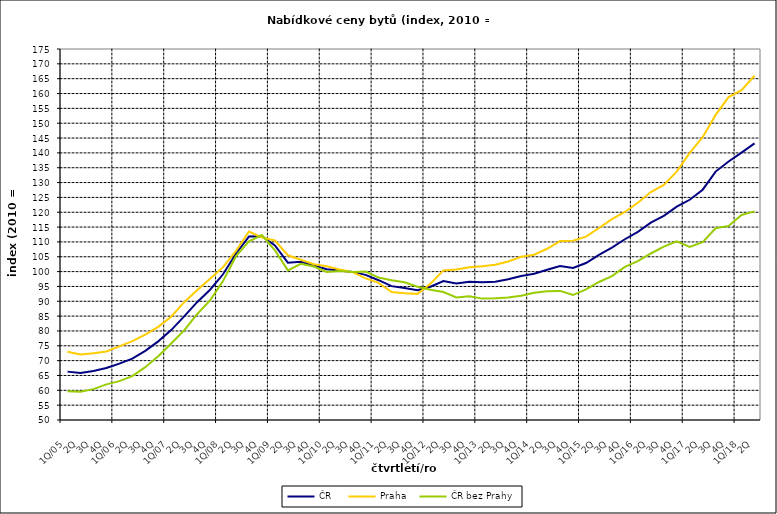
| Category | ČR  | Praha | ČR bez Prahy  |
|---|---|---|---|
| 1Q/05 | 66.3 | 73 | 59.7 |
| 2Q | 65.8 | 72.1 | 59.5 |
| 3Q | 66.5 | 72.5 | 60.4 |
| 4Q | 67.5 | 73.1 | 62 |
| 1Q/06 | 69 | 74.8 | 63.1 |
| 2Q | 70.7 | 76.6 | 64.8 |
| 3Q | 73.3 | 78.8 | 67.8 |
| 4Q | 76.5 | 81.4 | 71.5 |
| 1Q/07 | 80.3 | 84.8 | 75.8 |
| 2Q | 84.9 | 89.7 | 80.2 |
| 3Q | 89.7 | 93.7 | 85.7 |
| 4Q | 93.9 | 97.6 | 90.3 |
| 1Q/08 | 99.1 | 101.5 | 96.8 |
| 2Q | 106.1 | 107 | 105.2 |
| 3Q | 111.8 | 113.5 | 110.2 |
| 4Q | 111.9 | 111.5 | 112.3 |
| 1Q/09 | 108.8 | 110.5 | 107.2 |
| 2Q | 103 | 105.5 | 100.4 |
| 3Q | 103.3 | 104 | 102.6 |
| 4Q | 102.1 | 102.5 | 101.7 |
| 1Q/10 | 100.8 | 101.8 | 99.9 |
| 2Q | 100.4 | 100.7 | 100.2 |
| 3Q | 99.9 | 99.8 | 99.9 |
| 4Q | 98.9 | 97.7 | 100 |
| 1Q/11 | 97.1 | 96.2 | 98 |
| 2Q | 95.1 | 93.1 | 97.1 |
| 3Q | 94.5 | 92.7 | 96.4 |
| 4Q | 93.7 | 92.5 | 94.9 |
| 1Q/12 | 94.9 | 95.9 | 93.9 |
| 2Q | 96.8 | 100.4 | 93.1 |
| 3Q | 96 | 100.7 | 91.3 |
| 4Q | 96.6 | 101.5 | 91.7 |
| 1Q/13 | 96.4 | 101.8 | 90.9 |
| 2Q | 96.6 | 102.3 | 91 |
| 3Q | 97.4 | 103.4 | 91.3 |
| 4Q | 98.5 | 105 | 91.9 |
| 1Q/14 | 99.3 | 105.7 | 92.9 |
| 2Q | 100.6 | 107.7 | 93.4 |
| 3Q | 101.9 | 110.3 | 93.5 |
| 4Q | 101.2 | 110.4 | 92.1 |
| 1Q/15 | 102.9 | 111.8 | 94 |
| 2Q | 105.6 | 114.7 | 96.5 |
| 3Q | 108.1 | 117.7 | 98.5 |
| 4Q | 110.9 | 120.1 | 101.6 |
| 1Q/16 | 113.4 | 123.2 | 103.5 |
| 2Q | 116.5 | 126.8 | 106.1 |
| 3Q | 118.8 | 129.2 | 108.4 |
| 4Q | 121.9 | 133.7 | 110.2 |
| 1Q/17 | 124.2 | 140 | 108.3 |
| 2Q | 127.6 | 145.3 | 109.9 |
| 3Q | 133.7 | 152.8 | 114.6 |
| 4Q | 137.1 | 158.8 | 115.4 |
| 1Q/18 | 140.1 | 161.1 | 119.1 |
| 2Q | 143.2 | 166 | 120.3 |